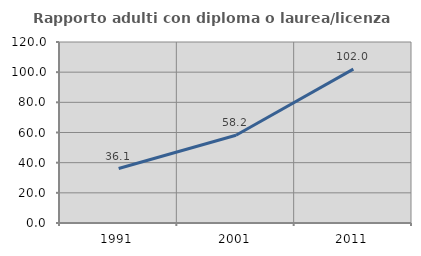
| Category | Rapporto adulti con diploma o laurea/licenza media  |
|---|---|
| 1991.0 | 36.104 |
| 2001.0 | 58.16 |
| 2011.0 | 102.009 |